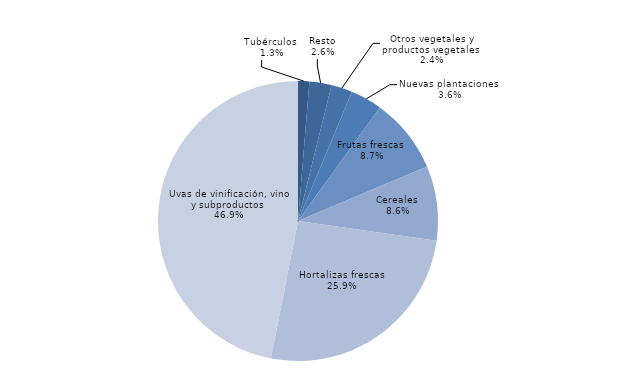
| Category | Series 0 |
|---|---|
| Tubérculos  | 6464.35 |
| Resto | 12723.53 |
| Otros vegetales y productos vegetales  | 12078.18 |
| Nuevas plantaciones  | 18134.44 |
| Frutas frescas  | 43304.95 |
| Cereales  | 42792.96 |
| Hortalizas frescas  | 128533.72 |
| Uvas de vinificación, vino y subproductos  | 233193.5 |